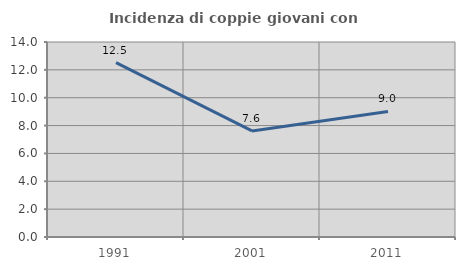
| Category | Incidenza di coppie giovani con figli |
|---|---|
| 1991.0 | 12.524 |
| 2001.0 | 7.615 |
| 2011.0 | 9.015 |